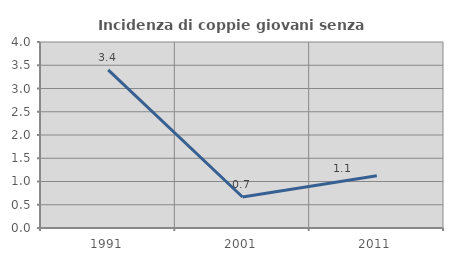
| Category | Incidenza di coppie giovani senza figli |
|---|---|
| 1991.0 | 3.399 |
| 2001.0 | 0.667 |
| 2011.0 | 1.124 |